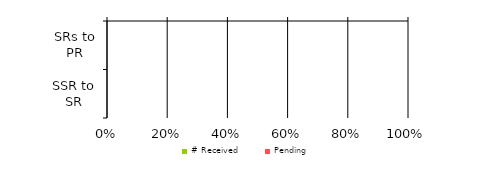
| Category | # Received | Pending |
|---|---|---|
| SSR to SR |  | 0 |
| SRs to PR |  | 0 |